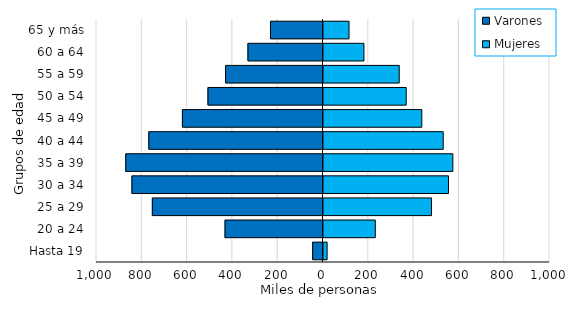
| Category | Varones | Mujeres |
|---|---|---|
| Hasta 19 | -45729 | 20339 |
| 20 a 24 | -432549 | 233112 |
| 25 a 29 | -753425 | 481138 |
| 30 a 34 | -843572 | 556280 |
| 35 a 39 | -870846 | 575437 |
| 40 a 44 | -769042 | 533059 |
| 45 a 49 | -620625 | 438496 |
| 50 a 54 | -507969 | 369558 |
| 55 a 59 | -430052 | 338760 |
| 60 a 64 | -331381 | 182952 |
| 65 y más | -231853 | 117191 |